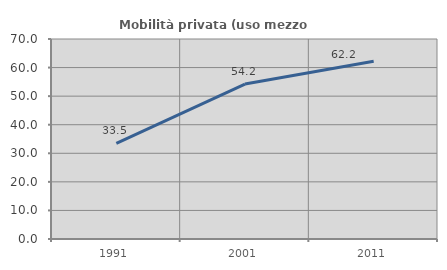
| Category | Mobilità privata (uso mezzo privato) |
|---|---|
| 1991.0 | 33.495 |
| 2001.0 | 54.217 |
| 2011.0 | 62.179 |